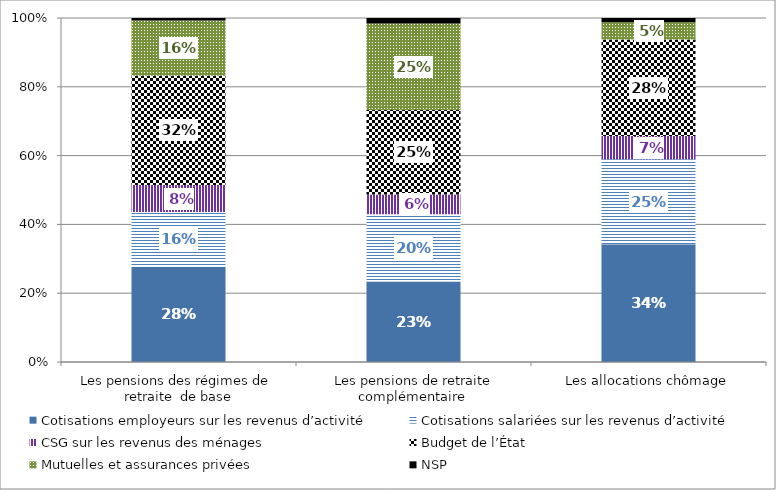
| Category | Cotisations employeurs sur les revenus d’activité | Cotisations salariées sur les revenus d’activité | CSG sur les revenus des ménages | Budget de l’État | Mutuelles et assurances privées | NSP |
|---|---|---|---|---|---|---|
| Les pensions des régimes de  retraite  de base | 0.277 | 0.159 | 0.079 | 0.318 | 0.16 | 0.008 |
|  Les pensions de retraite complémentaire | 0.234 | 0.195 | 0.057 | 0.246 | 0.251 | 0.016 |
| Les allocations chômage | 0.342 | 0.247 | 0.067 | 0.281 | 0.05 | 0.013 |